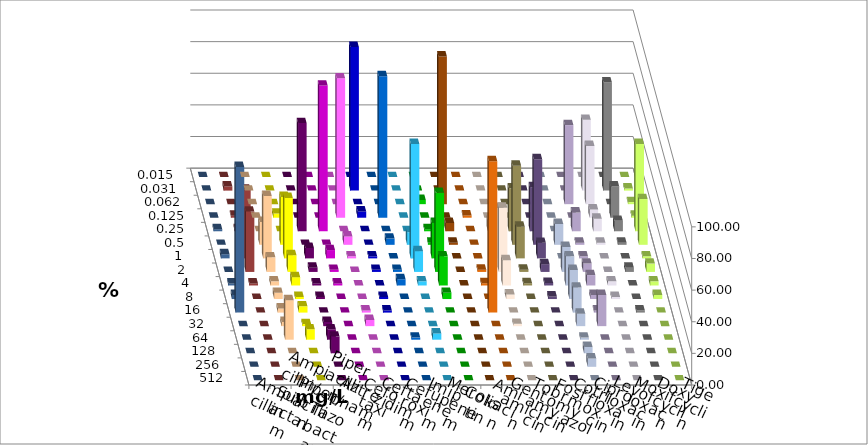
| Category | Ampicillin | Ampicillin/ Sulbactam | Piperacillin | Piperacillin/ Tazobactam | Aztreonam | Cefotaxim | Ceftazidim | Cefuroxim | Imipenem | Meropenem | Colistin | Amikacin | Gentamicin | Tobramycin | Fosfomycin | Cotrimoxazol | Ciprofloxacin | Levofloxacin | Moxifloxacin | Doxycyclin | Tigecyclin |
|---|---|---|---|---|---|---|---|---|---|---|---|---|---|---|---|---|---|---|---|---|---|
| 0.015 | 0 | 0 | 0 | 0 | 0 | 0 | 0 | 0 | 0 | 0 | 0 | 0 | 0 | 0 | 0 | 0 | 0 | 0 | 0 | 0 | 0 |
| 0.031 | 0 | 0 | 0 | 0 | 0 | 90.789 | 0 | 0 | 0 | 0 | 0 | 0 | 0 | 0 | 0 | 0 | 44.737 | 68.421 | 1.316 | 0 | 2.632 |
| 0.062 | 0 | 0 | 0 | 0 | 0 | 0 | 0 | 0 | 2.632 | 93.421 | 0 | 0 | 0 | 0 | 0 | 50 | 36.842 | 0 | 1.316 | 0 | 0 |
| 0.125 | 0 | 2.632 | 0 | 0 | 88.158 | 3.947 | 89.474 | 0 | 0 | 0 | 1.429 | 0 | 0 | 0 | 0 | 0 | 5.263 | 19.737 | 1.316 | 0 | 1.316 |
| 0.25 | 0 | 0 | 68.421 | 92.105 | 0 | 0 | 0 | 0 | 1.316 | 5.263 | 0 | 7.246 | 27.143 | 27.869 | 0 | 11.842 | 7.895 | 6.579 | 55.263 | 1.316 | 1.316 |
| 0.5 | 14.474 | 30.263 | 0 | 0 | 5.263 | 0 | 3.947 | 7.895 | 1.316 | 1.316 | 0 | 0 | 50 | 54.098 | 13.158 | 1.316 | 1.316 | 1.316 | 28.947 | 0 | 11.842 |
| 1.0 | 39.474 | 38.158 | 6.579 | 5.263 | 1.316 | 1.316 | 0 | 72.368 | 22.368 | 0 | 0 | 31.884 | 20 | 9.836 | 0 | 1.316 | 0 | 0 | 1.316 | 2.632 | 43.421 |
| 2.0 | 9.211 | 10.526 | 2.632 | 1.316 | 0 | 1.316 | 1.316 | 13.158 | 50 | 0 | 1.429 | 40.58 | 1.429 | 4.918 | 15.789 | 5.263 | 0 | 2.632 | 5.263 | 0 | 38.158 |
| 4.0 | 2.632 | 5.263 | 1.316 | 1.316 | 0 | 0 | 3.947 | 2.632 | 18.421 | 0 | 1.429 | 15.942 | 1.429 | 1.639 | 18.421 | 6.579 | 2.632 | 0 | 2.632 | 1.316 | 1.316 |
| 8.0 | 3.947 | 1.316 | 1.316 | 0 | 0 | 1.316 | 0 | 0 | 3.947 | 0 | 0 | 2.899 | 0 | 1.639 | 18.421 | 2.632 | 1.316 | 0 | 2.632 | 2.632 | 0 |
| 16.0 | 2.632 | 3.947 | 0 | 0 | 1.316 | 1.316 | 0 | 0 | 0 | 0 | 95.714 | 0 | 0 | 0 | 15.789 | 1.316 | 0 | 1.316 | 0 | 92.105 | 0 |
| 32.0 | 2.632 | 1.316 | 2.632 | 0 | 3.947 | 0 | 0 | 0 | 0 | 0 | 0 | 1.449 | 0 | 0 | 7.895 | 19.737 | 0 | 0 | 0 | 0 | 0 |
| 64.0 | 25 | 6.579 | 6.579 | 0 | 0 | 0 | 1.316 | 3.947 | 0 | 0 | 0 | 0 | 0 | 0 | 1.316 | 0 | 0 | 0 | 0 | 0 | 0 |
| 128.0 | 0 | 0 | 10.526 | 0 | 0 | 0 | 0 | 0 | 0 | 0 | 0 | 0 | 0 | 0 | 3.947 | 0 | 0 | 0 | 0 | 0 | 0 |
| 256.0 | 0 | 0 | 0 | 0 | 0 | 0 | 0 | 0 | 0 | 0 | 0 | 0 | 0 | 0 | 5.263 | 0 | 0 | 0 | 0 | 0 | 0 |
| 512.0 | 0 | 0 | 0 | 0 | 0 | 0 | 0 | 0 | 0 | 0 | 0 | 0 | 0 | 0 | 0 | 0 | 0 | 0 | 0 | 0 | 0 |